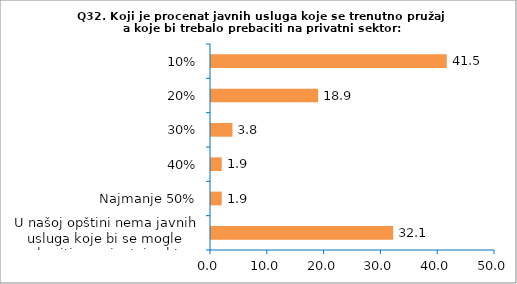
| Category | Series 0 |
|---|---|
| U našoj opštini nema javnih usluga koje bi se mogle prebaciti na privatni sektor | 32.075 |
| Najmanje 50% | 1.887 |
| 40% | 1.887 |
| 30% | 3.774 |
| 20% | 18.868 |
| 10% | 41.509 |